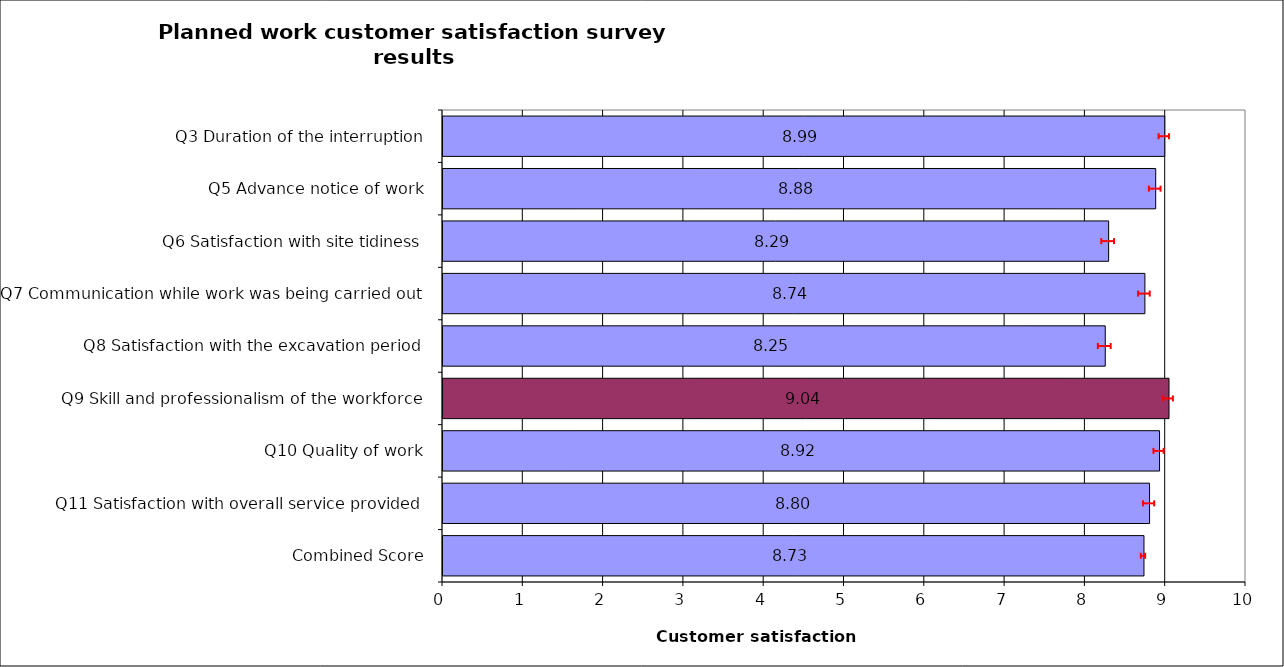
| Category | Series 0 |
|---|---|
| Q3 Duration of the interruption | 8.988 |
| Q5 Advance notice of work | 8.876 |
| Q6 Satisfaction with site tidiness | 8.289 |
| Q7 Communication while work was being carried out | 8.741 |
| Q8 Satisfaction with the excavation period | 8.247 |
| Q9 Skill and professionalism of the workforce | 9.041 |
| Q10 Quality of work | 8.923 |
| Q11 Satisfaction with overall service provided | 8.799 |
| Combined Score | 8.729 |